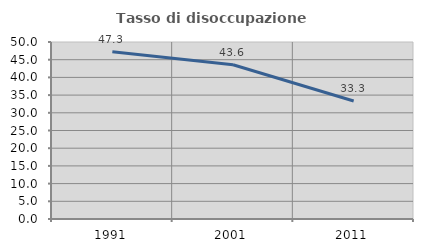
| Category | Tasso di disoccupazione giovanile  |
|---|---|
| 1991.0 | 47.273 |
| 2001.0 | 43.59 |
| 2011.0 | 33.333 |